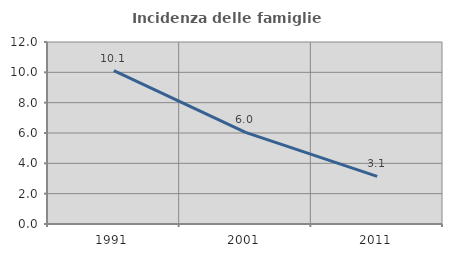
| Category | Incidenza delle famiglie numerose |
|---|---|
| 1991.0 | 10.107 |
| 2001.0 | 6.038 |
| 2011.0 | 3.143 |